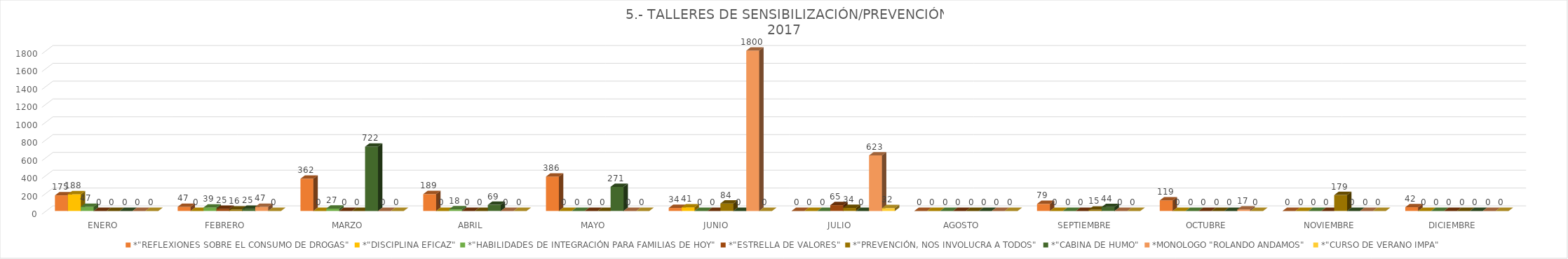
| Category | *"REFLEXIONES SOBRE EL CONSUMO DE DROGAS" | *"DISCIPLINA EFICAZ" | *"HABILIDADES DE INTEGRACIÓN PARA FAMILIAS DE HOY" | *"ESTRELLA DE VALORES" | *"PREVENCIÓN, NOS INVOLUCRA A TODOS" | *"CABINA DE HUMO" | *MONOLOGO "ROLANDO ANDAMOS" | *"CURSO DE VERANO IMPA" |
|---|---|---|---|---|---|---|---|---|
| ENERO | 175 | 188 | 47 | 0 | 0 | 0 | 0 | 0 |
| FEBRERO | 47 | 0 | 39 | 25 | 16 | 25 | 47 | 0 |
| MARZO | 362 | 0 | 27 | 0 | 0 | 722 | 0 | 0 |
| ABRIL | 189 | 0 | 18 | 0 | 0 | 69 | 0 | 0 |
| MAYO | 386 | 0 | 0 | 0 | 0 | 271 | 0 | 0 |
| JUNIO | 34 | 41 | 0 | 0 | 84 | 0 | 1800 | 0 |
| JULIO | 0 | 0 | 0 | 65 | 34 | 0 | 623 | 32 |
| AGOSTO | 0 | 0 | 0 | 0 | 0 | 0 | 0 | 0 |
| SEPTIEMBRE | 79 | 0 | 0 | 0 | 15 | 44 | 0 | 0 |
| OCTUBRE | 119 | 0 | 0 | 0 | 0 | 0 | 17 | 0 |
| NOVIEMBRE | 0 | 0 | 0 | 0 | 179 | 0 | 0 | 0 |
| DICIEMBRE | 42 | 0 | 0 | 0 | 0 | 0 | 0 | 0 |